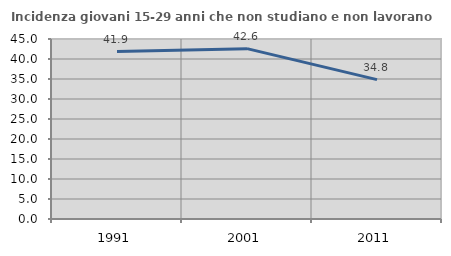
| Category | Incidenza giovani 15-29 anni che non studiano e non lavorano  |
|---|---|
| 1991.0 | 41.852 |
| 2001.0 | 42.586 |
| 2011.0 | 34.842 |